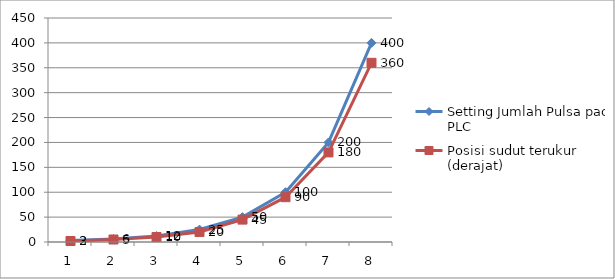
| Category | Setting Jumlah Pulsa pada PLC | Posisi sudut terukur (derajat) |
|---|---|---|
| 0 | 3 | 2 |
| 1 | 6 | 5 |
| 2 | 12 | 10 |
| 3 | 25 | 20 |
| 4 | 50 | 45 |
| 5 | 100 | 90 |
| 6 | 200 | 180 |
| 7 | 400 | 360 |